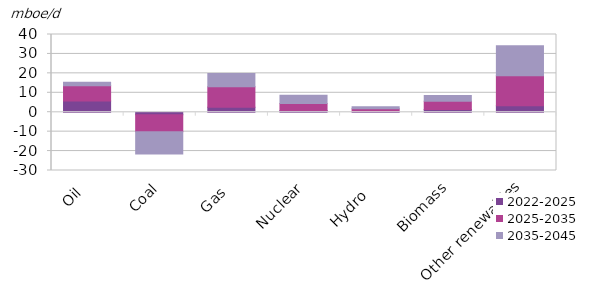
| Category | 2022-2025 | 2025-2035 | 2035-2045 |
|---|---|---|---|
| Oil | 5.796 | 7.808 | 1.814 |
| Coal | -1.302 | -8.731 | -11.503 |
| Gas | 2.585 | 10.57 | 6.81 |
| Nuclear | 0.868 | 3.558 | 4.351 |
| Hydro  | 0.416 | 1.4 | 0.969 |
| Biomass | 1.358 | 4.317 | 2.975 |
| Other renewables | 3.287 | 15.518 | 15.463 |